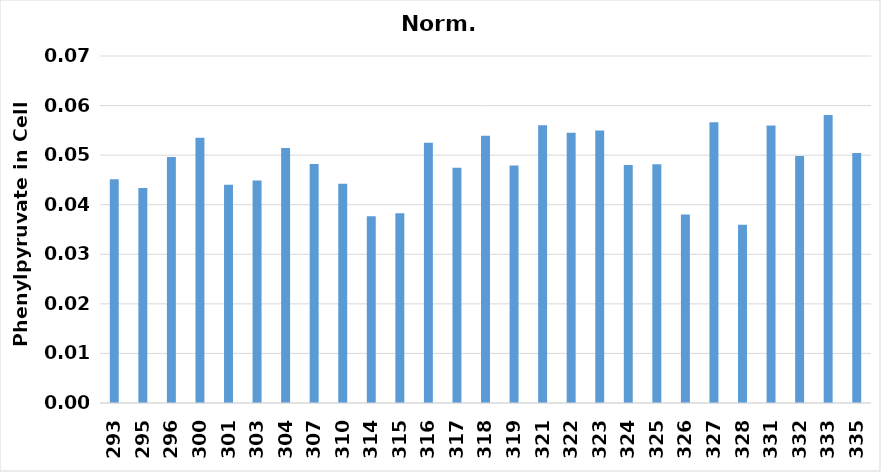
| Category | Series 0 |
|---|---|
| 293.0 | 0.045 |
| 295.0 | 0.043 |
| 296.0 | 0.05 |
| 300.0 | 0.054 |
| 301.0 | 0.044 |
| 303.0 | 0.045 |
| 304.0 | 0.051 |
| 307.0 | 0.048 |
| 310.0 | 0.044 |
| 314.0 | 0.038 |
| 315.0 | 0.038 |
| 316.0 | 0.052 |
| 317.0 | 0.047 |
| 318.0 | 0.054 |
| 319.0 | 0.048 |
| 321.0 | 0.056 |
| 322.0 | 0.054 |
| 323.0 | 0.055 |
| 324.0 | 0.048 |
| 325.0 | 0.048 |
| 326.0 | 0.038 |
| 327.0 | 0.057 |
| 328.0 | 0.036 |
| 331.0 | 0.056 |
| 332.0 | 0.05 |
| 333.0 | 0.058 |
| 335.0 | 0.05 |